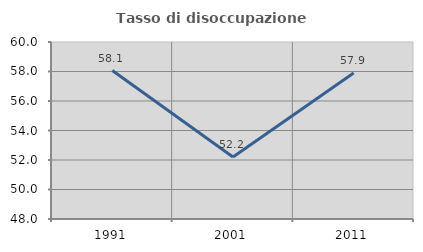
| Category | Tasso di disoccupazione giovanile  |
|---|---|
| 1991.0 | 58.065 |
| 2001.0 | 52.206 |
| 2011.0 | 57.895 |